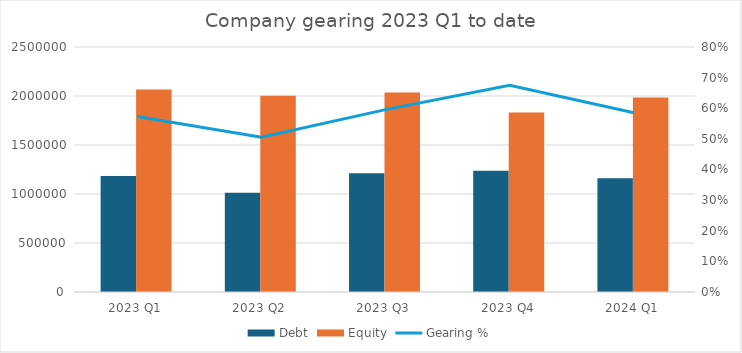
| Category | Debt | Equity |
|---|---|---|
| 2023 Q1 | 1183730 | 2065820 |
| 2023 Q2 | 1011941 | 2003223 |
| 2023 Q3 | 1212876 | 2036514 |
| 2023 Q4 | 1237053 | 1832265 |
| 2024 Q1 | 1161400 | 1984455.5 |